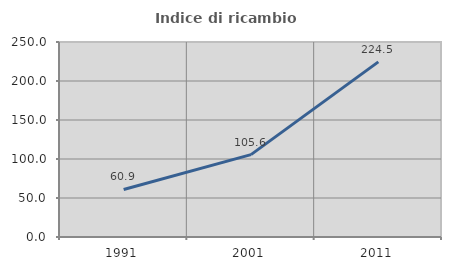
| Category | Indice di ricambio occupazionale  |
|---|---|
| 1991.0 | 60.941 |
| 2001.0 | 105.586 |
| 2011.0 | 224.539 |